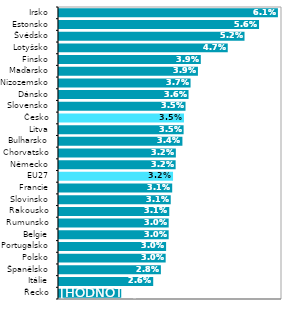
| Category | Series 0 |
|---|---|
| Řecko | 0.017 |
| Itálie | 0.026 |
| Španělsko | 0.028 |
| Polsko | 0.03 |
| Portugalsko | 0.03 |
| Belgie | 0.03 |
| Rumunsko | 0.03 |
| Rakousko | 0.031 |
| Slovinsko | 0.031 |
| Francie | 0.031 |
| EU27 | 0.032 |
| Německo | 0.032 |
| Chorvatsko | 0.032 |
| Bulharsko | 0.034 |
| Litva | 0.035 |
| Česko | 0.035 |
| Slovensko | 0.035 |
| Dánsko | 0.036 |
| Nizozemsko | 0.037 |
| Maďarsko | 0.039 |
| Finsko | 0.039 |
| Lotyšsko | 0.047 |
| Švédsko | 0.052 |
| Estonsko | 0.056 |
| Irsko | 0.061 |